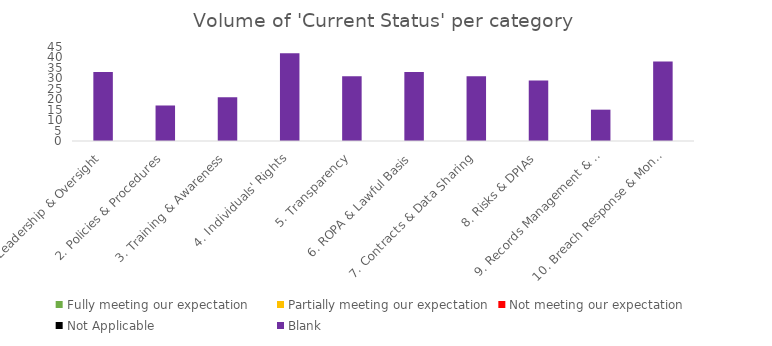
| Category | Fully meeting our expectation | Partially meeting our expectation | Not meeting our expectation | Not Applicable | Blank |
|---|---|---|---|---|---|
| 1. Leadership & Oversight | 0 | 0 | 0 | 0 | 33 |
| 2. Policies & Procedures | 0 | 0 | 0 | 0 | 17 |
| 3. Training & Awareness | 0 | 0 | 0 | 0 | 21 |
| 4. Individuals' Rights | 0 | 0 | 0 | 0 | 42 |
| 5. Transparency | 0 | 0 | 0 | 0 | 31 |
| 6. ROPA & Lawful Basis | 0 | 0 | 0 | 0 | 33 |
| 7. Contracts & Data Sharing | 0 | 0 | 0 | 0 | 31 |
| 8. Risks & DPIAs | 0 | 0 | 0 | 0 | 29 |
| 9. Records Management & Security | 0 | 0 | 0 | 0 | 15 |
| 10. Breach Response & Monitoring | 0 | 0 | 0 | 0 | 38 |